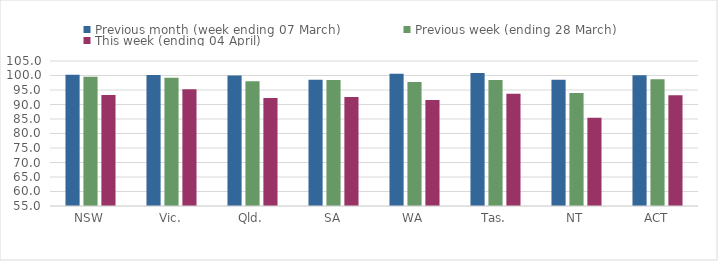
| Category | Previous month (week ending 07 March) | Previous week (ending 28 March) | This week (ending 04 April) |
|---|---|---|---|
| NSW | 100.233 | 99.535 | 93.276 |
| Vic. | 100.205 | 99.19 | 95.25 |
| Qld. | 100 | 98.024 | 92.201 |
| SA | 98.544 | 98.445 | 92.596 |
| WA | 100.605 | 97.72 | 91.556 |
| Tas. | 100.862 | 98.491 | 93.75 |
| NT | 98.502 | 94.007 | 85.393 |
| ACT | 100.102 | 98.726 | 93.174 |